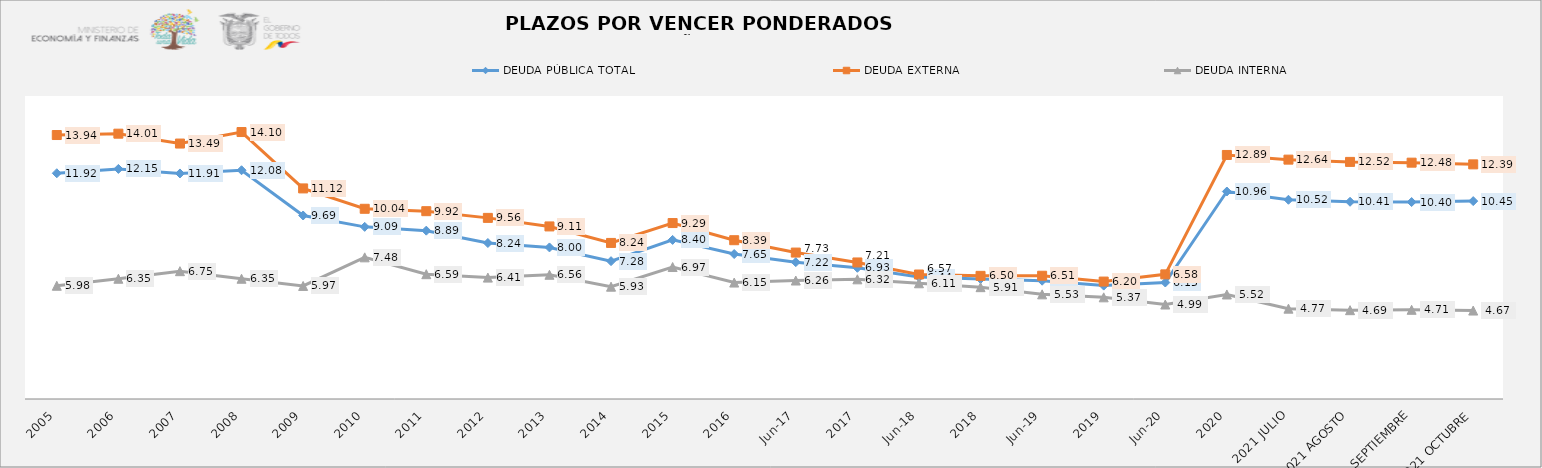
| Category | DEUDA PÚBLICA TOTAL | DEUDA EXTERNA  | DEUDA INTERNA |
|---|---|---|---|
| 2005 | 11.92 | 13.939 | 5.98 |
| 2006 | 12.15 | 14.01 | 6.35 |
| 2007 | 11.91 | 13.489 | 6.75 |
| 2008 | 12.08 | 14.097 | 6.35 |
| 2009 | 9.69 | 11.12 | 5.97 |
| 2010 | 9.09 | 10.045 | 7.48 |
| 2011 | 8.889 | 9.918 | 6.59 |
| 2012 | 8.237 | 9.564 | 6.41 |
| 2013 | 8.003 | 9.112 | 6.56 |
| 2014 | 7.278 | 8.241 | 5.93 |
| 2015 | 8.401 | 9.29 | 6.969 |
| 2016 | 7.655 | 8.385 | 6.149 |
| jun-17 | 7.224 | 7.733 | 6.257 |
| 2017 | 6.927 | 7.21 | 6.32 |
| jun-18 | 6.439 | 6.574 | 6.111 |
| 2018 | 6.337 | 6.503 | 5.906 |
| jun-19 | 6.246 | 6.509 | 5.526 |
| 2019 | 5.988 | 6.201 | 5.368 |
| jun-20 | 6.152 | 6.581 | 4.989 |
| 2020 | 10.957 | 12.887 | 5.519 |
| 2021 JULIO | 10.52 | 12.64 | 4.77 |
| 2021 AGOSTO | 10.414 | 12.52 | 4.69 |
| 2021 SEPTIEMBRE | 10.4 | 12.48 | 4.71 |
| 2021 OCTUBRE | 10.45 | 12.39 | 4.67 |